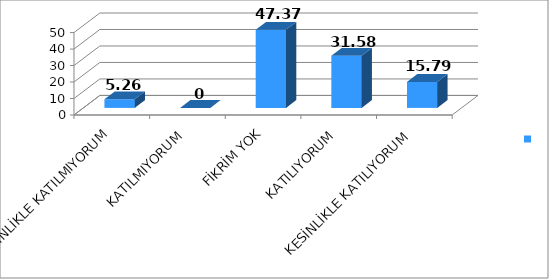
| Category | Series 0 |
|---|---|
| KESİNLİKLE KATILMIYORUM | 5.26 |
| KATILMIYORUM | 0 |
| FİKRİM YOK | 47.37 |
| KATILIYORUM | 31.58 |
| KESİNLİKLE KATILIYORUM | 15.79 |